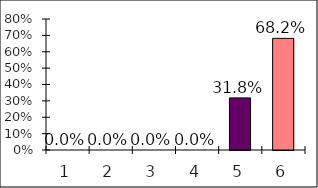
| Category | Series 0 |
|---|---|
| 0 | 0 |
| 1 | 0 |
| 2 | 0 |
| 3 | 0 |
| 4 | 0.318 |
| 5 | 0.682 |